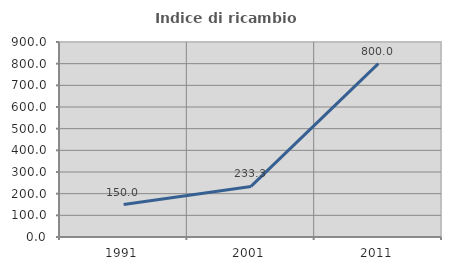
| Category | Indice di ricambio occupazionale  |
|---|---|
| 1991.0 | 150 |
| 2001.0 | 233.333 |
| 2011.0 | 800 |